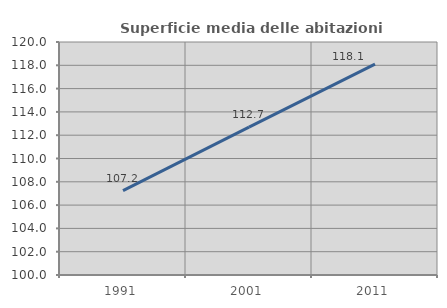
| Category | Superficie media delle abitazioni occupate |
|---|---|
| 1991.0 | 107.244 |
| 2001.0 | 112.693 |
| 2011.0 | 118.095 |